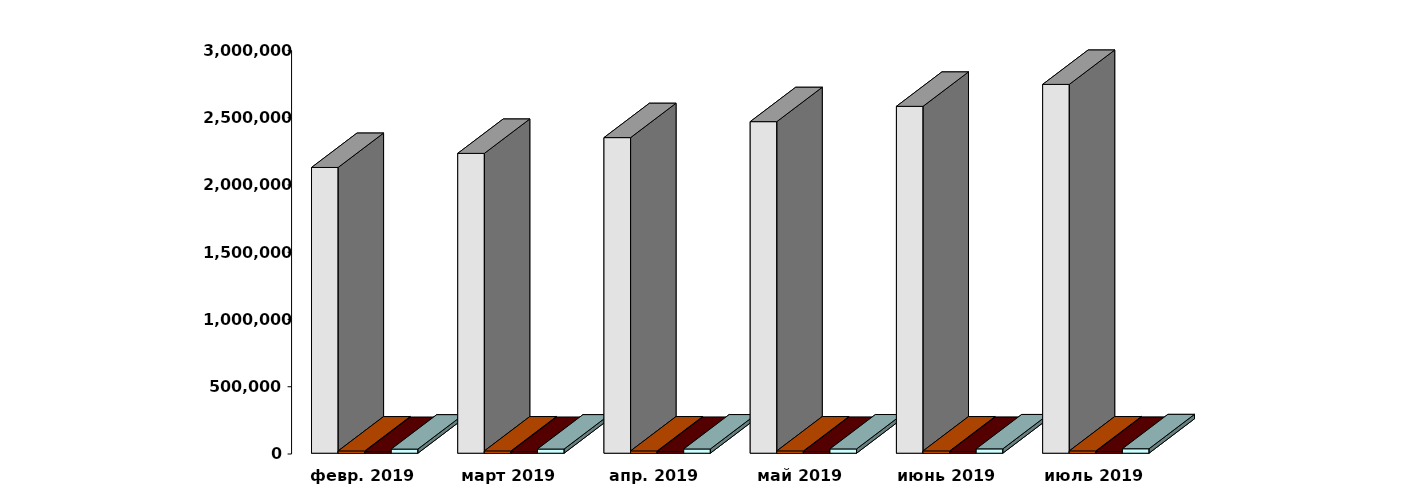
| Category | Физические лица | Юридические лица | Иностранные лица | Клиенты, передавшие свои средства в ДУ |
|---|---|---|---|---|
| 2019-02-28 | 2124042 | 16658 | 11740 | 30559 |
| 2019-03-30 | 2228680 | 16743 | 11947 | 30898 |
| 2019-04-30 | 2345873 | 16794 | 12185 | 31398 |
| 2019-05-30 | 2464521 | 16758 | 12375 | 31803 |
| 2019-06-30 | 2578398 | 16818 | 12464 | 32273 |
| 2019-07-30 | 2741361 | 16917 | 12726 | 33008 |